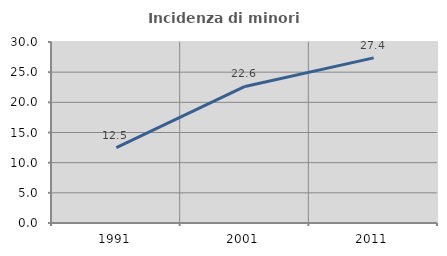
| Category | Incidenza di minori stranieri |
|---|---|
| 1991.0 | 12.5 |
| 2001.0 | 22.628 |
| 2011.0 | 27.371 |